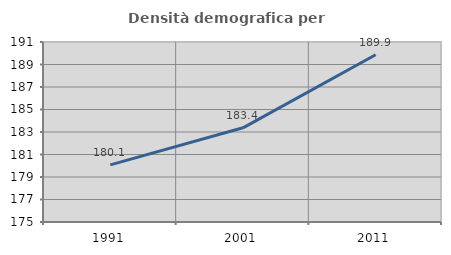
| Category | Densità demografica |
|---|---|
| 1991.0 | 180.076 |
| 2001.0 | 183.372 |
| 2011.0 | 189.865 |